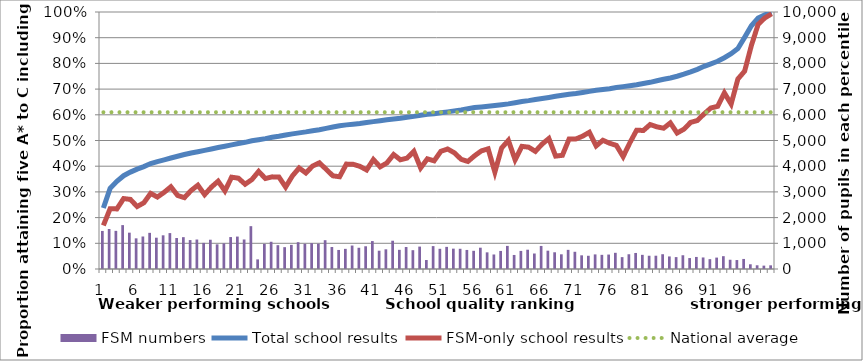
| Category | FSM numbers |
|---|---|
| 0 | 1481 |
| 1 | 1556 |
| 2 | 1484 |
| 3 | 1708 |
| 4 | 1414 |
| 5 | 1193 |
| 6 | 1265 |
| 7 | 1407 |
| 8 | 1218 |
| 9 | 1311 |
| 10 | 1397 |
| 11 | 1206 |
| 12 | 1239 |
| 13 | 1126 |
| 14 | 1147 |
| 15 | 1016 |
| 16 | 1139 |
| 17 | 960 |
| 18 | 997 |
| 19 | 1243 |
| 20 | 1262 |
| 21 | 1149 |
| 22 | 1667 |
| 23 | 374 |
| 24 | 977 |
| 25 | 1060 |
| 26 | 927 |
| 27 | 850 |
| 28 | 939 |
| 29 | 1043 |
| 30 | 982 |
| 31 | 1006 |
| 32 | 985 |
| 33 | 1121 |
| 34 | 855 |
| 35 | 741 |
| 36 | 784 |
| 37 | 913 |
| 38 | 826 |
| 39 | 885 |
| 40 | 1087 |
| 41 | 712 |
| 42 | 766 |
| 43 | 1100 |
| 44 | 746 |
| 45 | 855 |
| 46 | 732 |
| 47 | 872 |
| 48 | 350 |
| 49 | 891 |
| 50 | 786 |
| 51 | 861 |
| 52 | 792 |
| 53 | 787 |
| 54 | 741 |
| 55 | 708 |
| 56 | 829 |
| 57 | 648 |
| 58 | 565 |
| 59 | 703 |
| 60 | 899 |
| 61 | 546 |
| 62 | 704 |
| 63 | 751 |
| 64 | 603 |
| 65 | 897 |
| 66 | 713 |
| 67 | 651 |
| 68 | 572 |
| 69 | 745 |
| 70 | 670 |
| 71 | 532 |
| 72 | 515 |
| 73 | 568 |
| 74 | 551 |
| 75 | 562 |
| 76 | 630 |
| 77 | 462 |
| 78 | 574 |
| 79 | 624 |
| 80 | 551 |
| 81 | 516 |
| 82 | 517 |
| 83 | 575 |
| 84 | 489 |
| 85 | 463 |
| 86 | 535 |
| 87 | 426 |
| 88 | 469 |
| 89 | 449 |
| 90 | 383 |
| 91 | 444 |
| 92 | 499 |
| 93 | 360 |
| 94 | 349 |
| 95 | 391 |
| 96 | 184 |
| 97 | 145 |
| 98 | 131 |
| 99 | 143 |